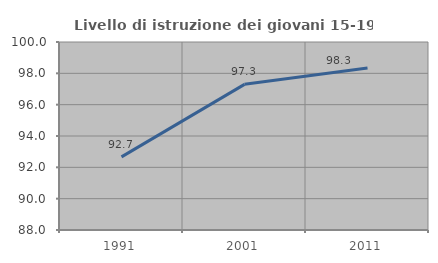
| Category | Livello di istruzione dei giovani 15-19 anni |
|---|---|
| 1991.0 | 92.665 |
| 2001.0 | 97.297 |
| 2011.0 | 98.347 |